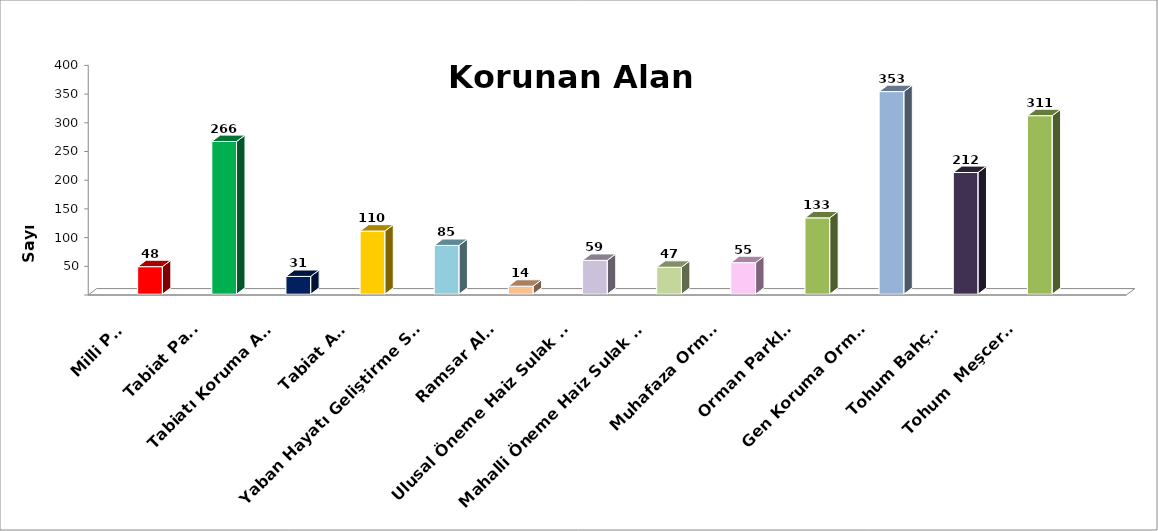
| Category | Series 0 | Series 1 | Series 2 |
|---|---|---|---|
| Milli Park |  |  | 48 |
| Tabiat Parkı |  |  | 266 |
| Tabiatı Koruma Alanı |  |  | 31 |
| Tabiat Anıtı |  |  | 110 |
| Yaban Hayatı Geliştirme Sahası |  |  | 85 |
| Ramsar Alanı |  |  | 14 |
| Ulusal Öneme Haiz Sulak Alan |  |  | 59 |
| Mahalli Öneme Haiz Sulak Alan |  |  | 47 |
| Muhafaza Ormanı |  |  | 55 |
| Orman Parkları |  |  | 133 |
| Gen Koruma Ormanı |  |  | 353 |
| Tohum Bahçesi |  |  | 212 |
| Tohum  Meşceresi |  |  | 311 |